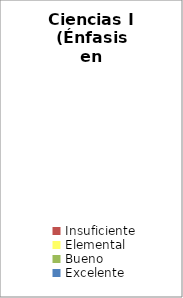
| Category | Ciencias I (Énfasis en Biología) |
|---|---|
| Insuficiente | 0 |
| Elemental | 0 |
| Bueno | 0 |
| Excelente | 0 |